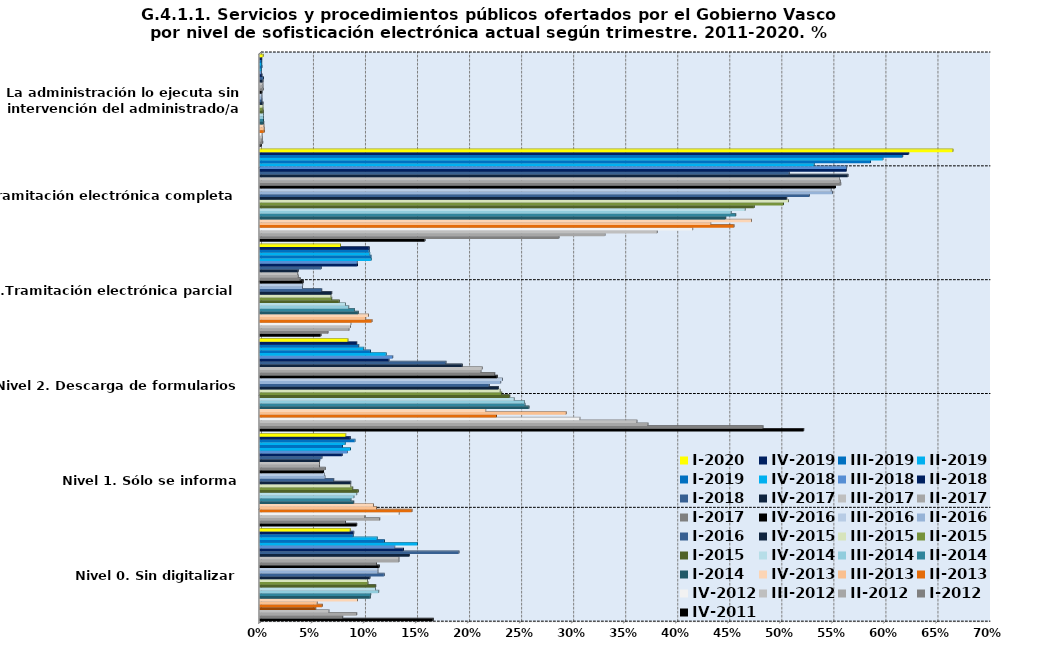
| Category | IV-2011 | I-2012 | II-2012 | III-2012 | IV-2012 | II-2013 | III-2013 | IV-2013 | I-2014 | II-2014 | III-2014 | IV-2014 | I-2015 | II-2015 | III-2015 | IV-2015 | I-2016 | II-2016 | III-2016 | IV-2016 | I-2017 | II-2017 | III-2017 | IV-2017 | I-2018 | II-2018 | III-2018 | IV-2018 | I-2019 | II-2019 | III-2019 | IV-2019 | I-2020 |
|---|---|---|---|---|---|---|---|---|---|---|---|---|---|---|---|---|---|---|---|---|---|---|---|---|---|---|---|---|---|---|---|---|---|
| Nivel 0. Sin digitalizar | 0.166 | 0.079 | 0.093 | 0.066 | 0.054 | 0.06 | 0.055 | 0.094 | 0.106 | 0.106 | 0.114 | 0.111 | 0.111 | 0.104 | 0.103 | 0.106 | 0.119 | 0.113 | 0.113 | 0.115 | 0.112 | 0.134 | 0.134 | 0.144 | 0.191 | 0.138 | 0.13 | 0.151 | 0.12 | 0.113 | 0.09 | 0.09 | 0.087 |
| Nivel 1. Sólo se informa | 0.093 | 0.082 | 0.115 | 0.101 | 0.134 | 0.146 | 0.112 | 0.109 | 0.09 | 0.087 | 0.09 | 0.093 | 0.095 | 0.089 | 0.087 | 0.087 | 0.071 | 0.063 | 0.062 | 0.061 | 0.063 | 0.057 | 0.057 | 0.057 | 0.06 | 0.079 | 0.084 | 0.087 | 0.079 | 0.082 | 0.091 | 0.087 | 0.083 |
| Nivel 2. Descarga de formularios | 0.522 | 0.483 | 0.373 | 0.362 | 0.307 | 0.227 | 0.294 | 0.217 | 0.258 | 0.255 | 0.254 | 0.244 | 0.24 | 0.232 | 0.231 | 0.229 | 0.22 | 0.231 | 0.233 | 0.228 | 0.226 | 0.212 | 0.213 | 0.194 | 0.179 | 0.124 | 0.128 | 0.121 | 0.106 | 0.1 | 0.095 | 0.093 | 0.085 |
| Nivel 3.Tramitación electrónica parcial | 0.059 | 0.065 | 0.086 | 0.087 | 0.087 | 0.108 | 0.102 | 0.104 | 0.094 | 0.091 | 0.085 | 0.082 | 0.076 | 0.069 | 0.068 | 0.069 | 0.059 | 0.041 | 0.041 | 0.042 | 0.039 | 0.037 | 0.036 | 0.037 | 0.059 | 0.094 | 0.094 | 0.107 | 0.107 | 0.106 | 0.105 | 0.105 | 0.077 |
| Nivel 4 Tramitación electrónica completa | 0.158 | 0.287 | 0.332 | 0.382 | 0.416 | 0.455 | 0.433 | 0.472 | 0.447 | 0.457 | 0.453 | 0.466 | 0.475 | 0.503 | 0.508 | 0.506 | 0.528 | 0.55 | 0.549 | 0.553 | 0.558 | 0.557 | 0.557 | 0.565 | 0.509 | 0.564 | 0.564 | 0.532 | 0.587 | 0.598 | 0.617 | 0.623 | 0.666 |
| Nivel 5. La administración lo ejecuta sin intervención del administrado/a | 0.001 | 0.003 | 0.002 | 0.002 | 0.002 | 0.004 | 0.004 | 0.004 | 0.004 | 0.003 | 0.003 | 0.003 | 0.003 | 0.003 | 0.003 | 0.003 | 0.002 | 0.002 | 0.002 | 0.002 | 0.003 | 0.003 | 0.003 | 0.003 | 0.003 | 0.002 | 0.001 | 0.001 | 0.002 | 0.002 | 0.002 | 0.002 | 0.003 |